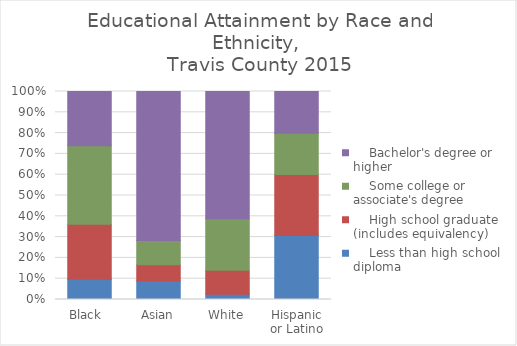
| Category |     Less than high school diploma |     High school graduate (includes equivalency) |     Some college or associate's degree |     Bachelor's degree or higher |
|---|---|---|---|---|
| Black  | 0.097 | 0.265 | 0.377 | 0.261 |
| Asian | 0.089 | 0.078 | 0.117 | 0.716 |
| White | 0.025 | 0.116 | 0.248 | 0.611 |
| Hispanic or Latino | 0.308 | 0.293 | 0.199 | 0.2 |